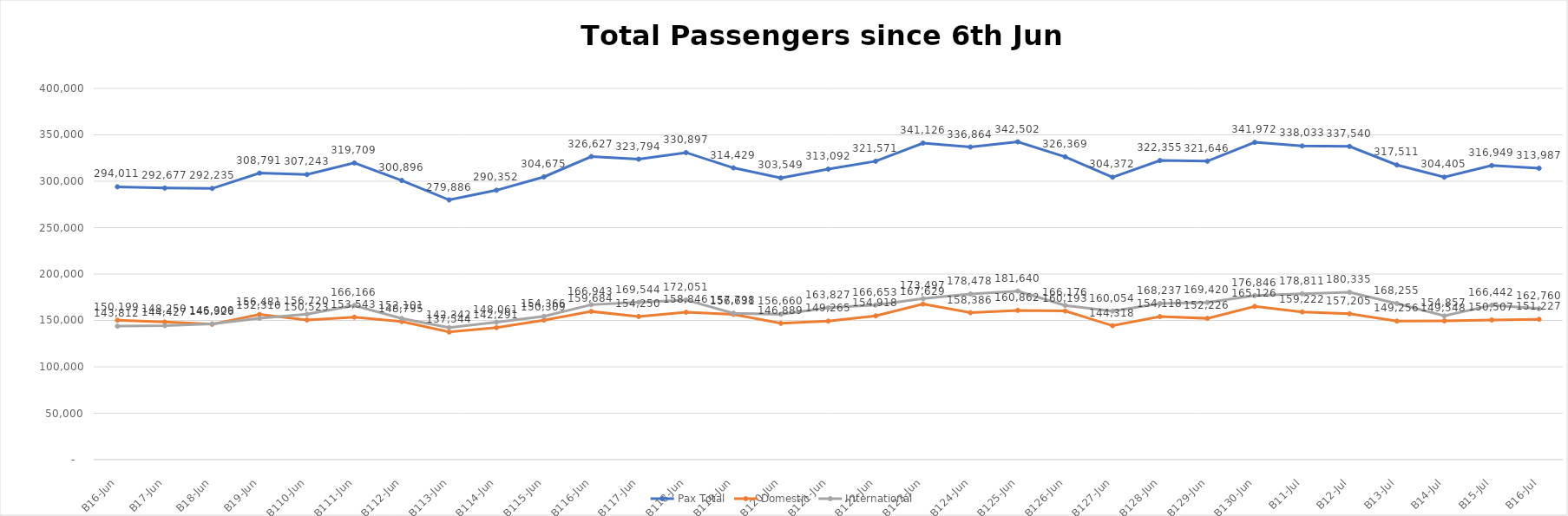
| Category | Pax Total |  Domestic  |  International  |
|---|---|---|---|
| 2023-06-06 | 294011 | 150199 | 143812 |
| 2023-06-07 | 292677 | 148250 | 144427 |
| 2023-06-08 | 292235 | 145926 | 146309 |
| 2023-06-09 | 308791 | 156481 | 152310 |
| 2023-06-10 | 307243 | 150523 | 156720 |
| 2023-06-11 | 319709 | 153543 | 166166 |
| 2023-06-12 | 300896 | 148795 | 152101 |
| 2023-06-13 | 279886 | 137544 | 142342 |
| 2023-06-14 | 290352 | 142291 | 148061 |
| 2023-06-15 | 304675 | 150309 | 154366 |
| 2023-06-16 | 326627 | 159684 | 166943 |
| 2023-06-17 | 323794 | 154250 | 169544 |
| 2023-06-18 | 330897 | 158846 | 172051 |
| 2023-06-19 | 314429 | 156631 | 157798 |
| 2023-06-20 | 303549 | 146889 | 156660 |
| 2023-06-21 | 313092 | 149265 | 163827 |
| 2023-06-22 | 321571 | 154918 | 166653 |
| 2023-06-23 | 341126 | 167629 | 173497 |
| 2023-06-24 | 336864 | 158386 | 178478 |
| 2023-06-25 | 342502 | 160862 | 181640 |
| 2023-06-26 | 326369 | 160193 | 166176 |
| 2023-06-27 | 304372 | 144318 | 160054 |
| 2023-06-28 | 322355 | 154118 | 168237 |
| 2023-06-29 | 321646 | 152226 | 169420 |
| 2023-06-30 | 341972 | 165126 | 176846 |
| 2023-07-01 | 338033 | 159222 | 178811 |
| 2023-07-02 | 337540 | 157205 | 180335 |
| 2023-07-03 | 317511 | 149256 | 168255 |
| 2023-07-04 | 304405 | 149548 | 154857 |
| 2023-07-05 | 316949 | 150507 | 166442 |
| 2023-07-06 | 313987 | 151227 | 162760 |